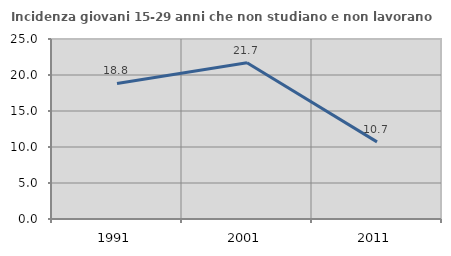
| Category | Incidenza giovani 15-29 anni che non studiano e non lavorano  |
|---|---|
| 1991.0 | 18.824 |
| 2001.0 | 21.691 |
| 2011.0 | 10.714 |